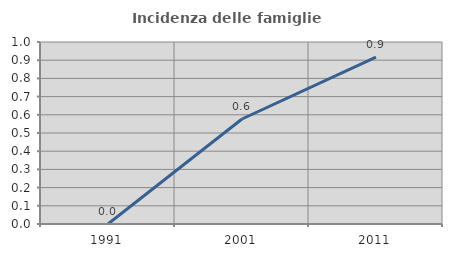
| Category | Incidenza delle famiglie numerose |
|---|---|
| 1991.0 | 0 |
| 2001.0 | 0.577 |
| 2011.0 | 0.917 |